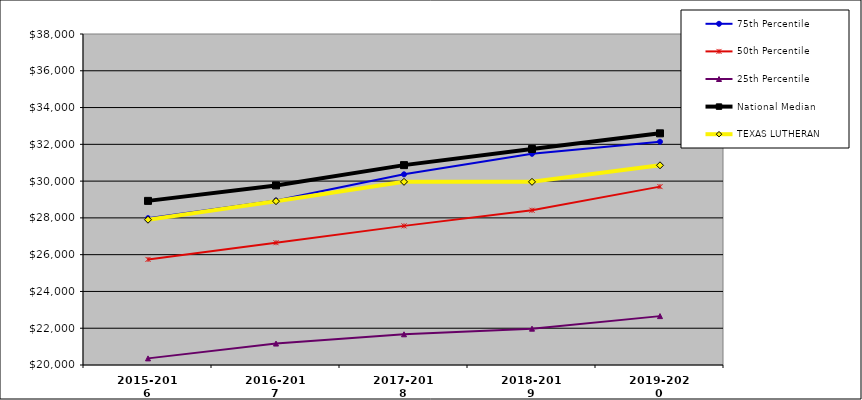
| Category | 75th Percentile | 50th Percentile | 25th Percentile | National Median | TEXAS LUTHERAN |
|---|---|---|---|---|---|
| 2015-2016 | 27986 | 25742 | 20360 | 28924.5 | 27900 |
| 2016-2017 | 28943 | 26650 | 21166 | 29767 | 28910 |
| 2017-2018 | 30370 | 27566 | 21670 | 30869 | 29960 |
| 2018-2019 | 31485 | 28415 | 21976 | 31745 | 29960 |
| 2019-2020 | 32140 | 29700 | 22658 | 32598 | 30860 |